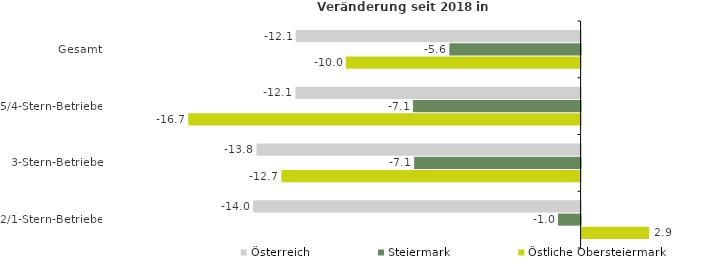
| Category | Österreich | Steiermark | Östliche Obersteiermark |
|---|---|---|---|
| Gesamt | -12.137 | -5.59 | -9.997 |
| 5/4-Stern-Betriebe | -12.15 | -7.138 | -16.709 |
| 3-Stern-Betriebe | -13.805 | -7.09 | -12.743 |
| 2/1-Stern-Betriebe | -13.951 | -0.963 | 2.876 |